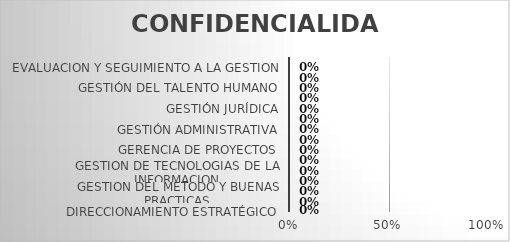
| Category | CONFIDENCIALIDAD |
|---|---|
| DIRECCIONAMIENTO ESTRATÉGICO | 0 |
| GESTIÓN DE PROVEEDORES | 0 |
| GESTION DEL METODO Y BUENAS PRACTICAS | 0 |
| GESTION DE COMUNICACIONES | 0 |
| GESTION DE TECNOLOGIAS DE LA INFORMACION | 0 |
| ESTRUCTURACION DE PROYECTOS | 0 |
| GERENCIA DE PROYECTOS | 0 |
| EVALUACION DE PROYECTOS | 0 |
| GESTIÓN ADMINISTRATIVA | 0 |
| GESTIÓN DEL RIESGO | 0 |
| GESTIÓN JURÍDICA | 0 |
| GESTIÓN FINANCIERA | 0 |
| GESTIÓN DEL TALENTO HUMANO | 0 |
| AUDITORIA INTERNA | 0 |
| EVALUACION Y SEGUIMIENTO A LA GESTION | 0 |